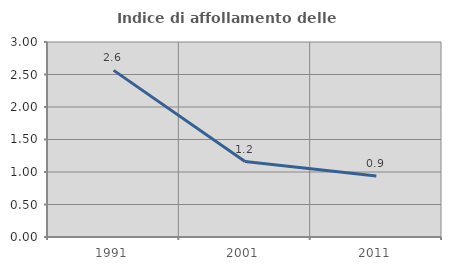
| Category | Indice di affollamento delle abitazioni  |
|---|---|
| 1991.0 | 2.563 |
| 2001.0 | 1.161 |
| 2011.0 | 0.939 |